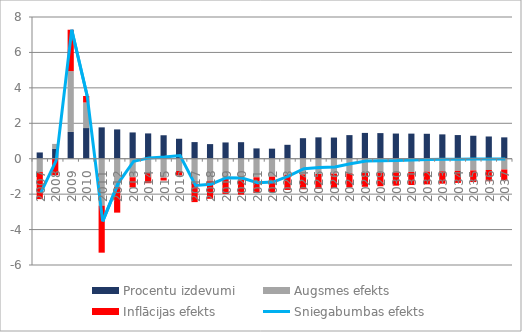
| Category | Procentu izdevumi | Augsmes efekts | Inflācijas efekts |
|---|---|---|---|
| 0 | 0.353 | -0.754 | -1.527 |
| 1 | 0.551 | 0.285 | -0.933 |
| 2 | 1.511 | 3.434 | 2.337 |
| 3 | 1.731 | 1.442 | 0.368 |
| 4 | 1.77 | -2.65 | -2.655 |
| 5 | 1.655 | -1.594 | -1.45 |
| 6 | 1.483 | -1.047 | -0.579 |
| 7 | 1.428 | -0.798 | -0.585 |
| 8 | 1.324 | -1.075 | -0.157 |
| 9 | 1.127 | -0.694 | -0.255 |
| 10 | 0.938 | -1.39 | -1.06 |
| 11 | 0.825 | -1.245 | -1.018 |
| 12 | 0.918 | -1.135 | -0.853 |
| 13 | 0.933 | -1.17 | -0.858 |
| 14 | 0.582 | -1.048 | -0.89 |
| 15 | 0.569 | -1.014 | -0.872 |
| 16 | 0.785 | -0.91 | -0.854 |
| 17 | 1.158 | -0.884 | -0.839 |
| 18 | 1.206 | -0.863 | -0.832 |
| 19 | 1.195 | -0.843 | -0.815 |
| 20 | 1.332 | -0.822 | -0.797 |
| 21 | 1.457 | -0.803 | -0.781 |
| 22 | 1.445 | -0.787 | -0.768 |
| 23 | 1.421 | -0.769 | -0.753 |
| 24 | 1.417 | -0.75 | -0.736 |
| 25 | 1.408 | -0.73 | -0.718 |
| 26 | 1.374 | -0.708 | -0.7 |
| 27 | 1.335 | -0.686 | -0.68 |
| 28 | 1.297 | -0.662 | -0.658 |
| 29 | 1.255 | -0.636 | -0.634 |
| 30 | 1.206 | -0.609 | -0.609 |